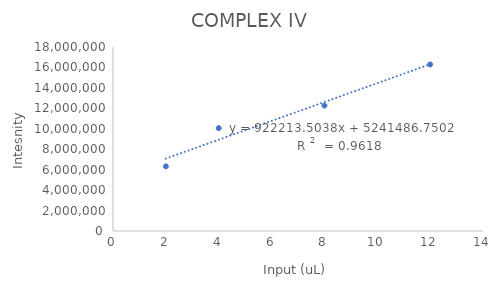
| Category | Series 0 |
|---|---|
| 8.0 | 12267881.493 |
| 4.0 | 10062303.516 |
| 2.0 | 6320868.873 |
| 12.0 | 16292444.219 |